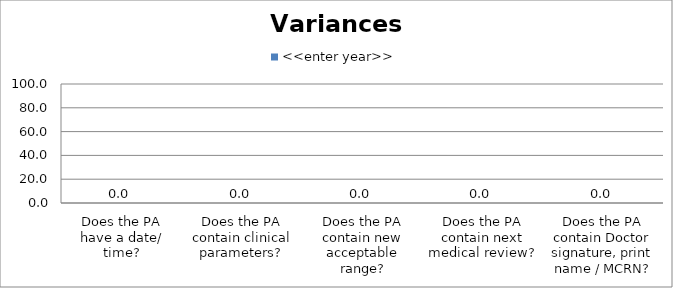
| Category | <<enter year>> |
|---|---|
| Does the PA have a date/ time? | 0 |
| Does the PA contain clinical parameters? | 0 |
| Does the PA contain new acceptable range? | 0 |
| Does the PA contain next medical review? | 0 |
| Does the PA contain Doctor signature, print name / MCRN? | 0 |